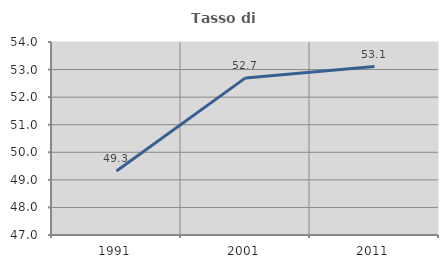
| Category | Tasso di occupazione   |
|---|---|
| 1991.0 | 49.321 |
| 2001.0 | 52.699 |
| 2011.0 | 53.109 |